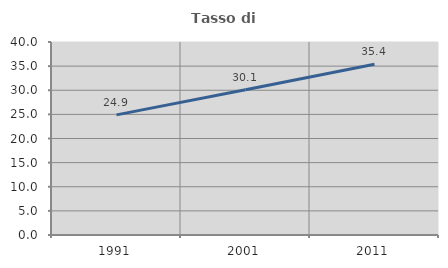
| Category | Tasso di occupazione   |
|---|---|
| 1991.0 | 24.896 |
| 2001.0 | 30.094 |
| 2011.0 | 35.405 |